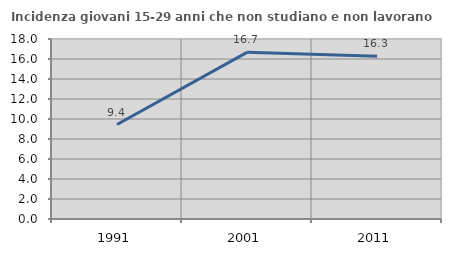
| Category | Incidenza giovani 15-29 anni che non studiano e non lavorano  |
|---|---|
| 1991.0 | 9.449 |
| 2001.0 | 16.667 |
| 2011.0 | 16.279 |